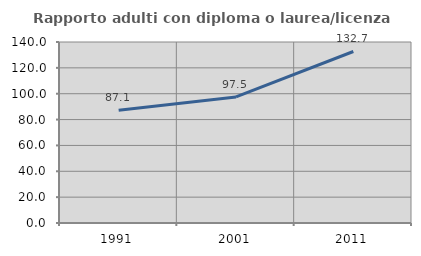
| Category | Rapporto adulti con diploma o laurea/licenza media  |
|---|---|
| 1991.0 | 87.123 |
| 2001.0 | 97.547 |
| 2011.0 | 132.664 |